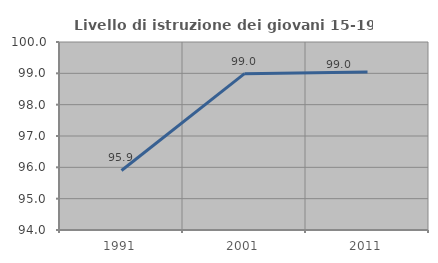
| Category | Livello di istruzione dei giovani 15-19 anni |
|---|---|
| 1991.0 | 95.899 |
| 2001.0 | 98.99 |
| 2011.0 | 99.043 |